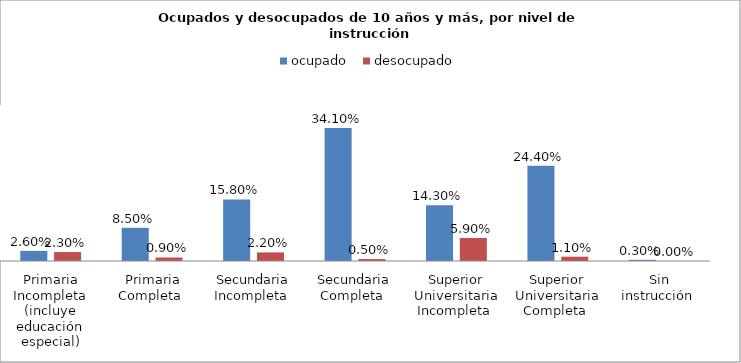
| Category | ocupado  | desocupado |
|---|---|---|
| Primaria Incompleta (incluye educación especial) | 0.026 | 0.023 |
| Primaria Completa  | 0.085 | 0.009 |
| Secundaria Incompleta  | 0.158 | 0.022 |
| Secundaria Completa  | 0.341 | 0.005 |
| Superior Universitaria Incompleta  | 0.143 | 0.059 |
| Superior Universitaria Completa  | 0.244 | 0.011 |
| Sin instrucción  | 0.003 | 0 |